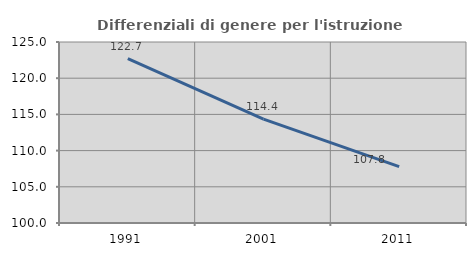
| Category | Differenziali di genere per l'istruzione superiore |
|---|---|
| 1991.0 | 122.709 |
| 2001.0 | 114.353 |
| 2011.0 | 107.797 |